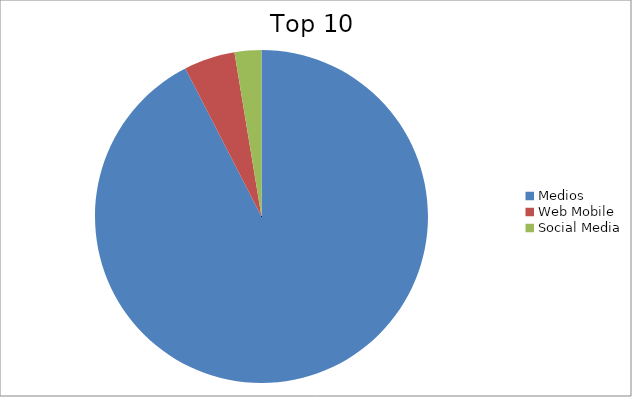
| Category | Series 0 |
|---|---|
| Medios | 92.44 |
| Web Mobile | 4.96 |
| Social Media | 2.6 |